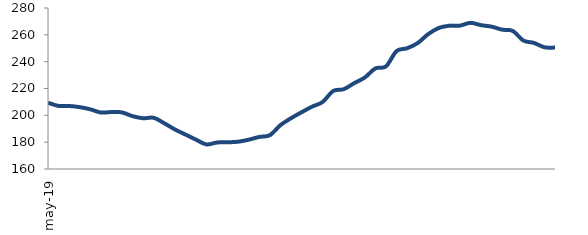
| Category | Series 0 |
|---|---|
| 2019-05-01 | 209.393 |
| 2019-06-01 | 207.032 |
| 2019-07-01 | 206.974 |
| 2019-08-01 | 206.107 |
| 2019-09-01 | 204.488 |
| 2019-10-01 | 202.111 |
| 2019-11-01 | 202.424 |
| 2019-12-01 | 202.177 |
| 2020-01-01 | 199.409 |
| 2020-02-01 | 197.826 |
| 2020-03-01 | 198.161 |
| 2020-04-01 | 194.123 |
| 2020-05-01 | 189.538 |
| 2020-06-01 | 185.731 |
| 2020-07-01 | 181.914 |
| 2020-08-01 | 178.343 |
| 2020-09-01 | 179.758 |
| 2020-10-01 | 179.9 |
| 2020-11-01 | 180.346 |
| 2020-12-01 | 181.827 |
| 2021-01-01 | 183.909 |
| 2021-02-01 | 185.191 |
| 2021-03-01 | 192.66 |
| 2021-04-01 | 197.814 |
| 2021-05-01 | 202.28 |
| 2021-06-01 | 206.474 |
| 2021-07-01 | 209.951 |
| 2021-08-01 | 218.146 |
| 2021-09-01 | 219.495 |
| 2021-10-01 | 224.001 |
| 2021-11-01 | 228.234 |
| 2021-12-01 | 234.966 |
| 2022-01-01 | 236.495 |
| 2022-02-01 | 247.883 |
| 2022-03-01 | 250.016 |
| 2022-04-01 | 253.872 |
| 2022-05-01 | 260.574 |
| 2022-06-01 | 265.125 |
| 2022-07-01 | 266.79 |
| 2022-08-01 | 266.867 |
| 2022-09-01 | 268.948 |
| 2022-10-01 | 267.186 |
| 2022-11-01 | 266.12 |
| 2022-12-01 | 263.849 |
| 2023-01-01 | 262.911 |
| 2023-02-01 | 255.756 |
| 2023-03-01 | 253.995 |
| 2023-04-01 | 250.72 |
| 2023-05-01 | 250.501 |